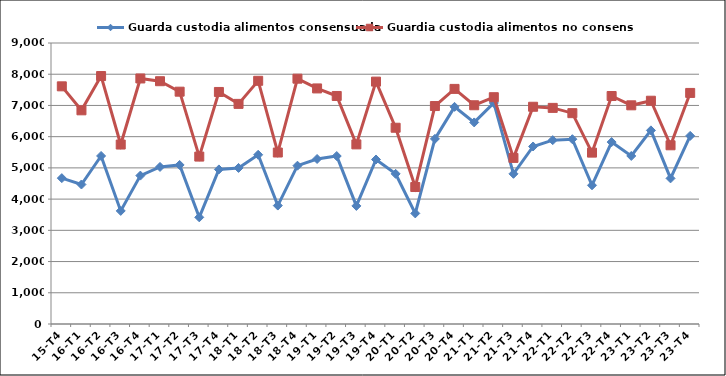
| Category | Guarda custodia alimentos consensuada | Guardia custodia alimentos no consensuada |
|---|---|---|
| 15-T4 | 4672 | 7612 |
| 16-T1 | 4468 | 6844 |
| 16-T2 | 5382 | 7942 |
| 16-T3 | 3622 | 5748 |
| 16-T4 | 4753 | 7864 |
| 17-T1 | 5030 | 7776 |
| 17-T2 | 5094 | 7441 |
| 17-T3 | 3417 | 5362 |
| 17-T4 | 4951 | 7432 |
| 18-T1 | 4998 | 7050 |
| 18-T2 | 5420 | 7789 |
| 18-T3 | 3793 | 5492 |
| 18-T4 | 5070 | 7857 |
| 19-T1 | 5285 | 7545 |
| 19-T2 | 5380 | 7303 |
| 19-T3 | 3782 | 5753 |
| 19-T4 | 5269 | 7763 |
| 20-T1 | 4809 | 6286 |
| 20-T2 | 3542 | 4387 |
| 20-T3 | 5930 | 6981 |
| 20-T4 | 6955 | 7530 |
| 21-T1 | 6456 | 7006 |
| 21-T2 | 7080 | 7264 |
| 21-T3 | 4810 | 5320 |
| 21-T4 | 5686 | 6958 |
| 22-T1 | 5888 | 6922 |
| 22-T2 | 5919 | 6753 |
| 22-T3 | 4443 | 5489 |
| 22-T4 | 5827 | 7302 |
| 23-T1 | 5382 | 7004 |
| 23-T2 | 6202 | 7151 |
| 23-T3 | 4664 | 5724 |
| 23-T4 | 6025 | 7401 |